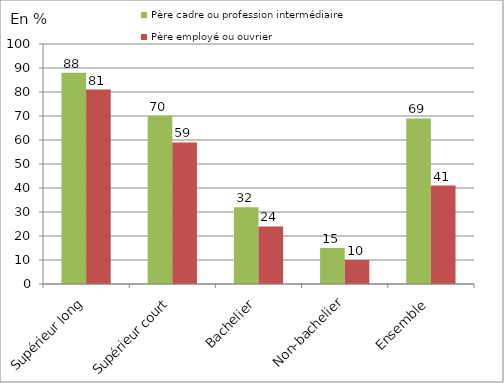
| Category | Père cadre ou profession intermédiaire | Père employé ou ouvrier |
|---|---|---|
| Supérieur long | 88 | 81 |
| Supérieur court | 70 | 59 |
| Bachelier | 32 | 24 |
| Non-bachelier | 15 | 10 |
| Ensemble | 69 | 41 |